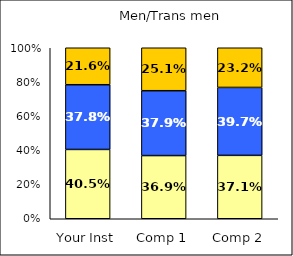
| Category | Low Civic Minded Values | Average Civic Minded Values | High Civic Minded Values |
|---|---|---|---|
| Your Inst | 0.405 | 0.378 | 0.216 |
| Comp 1 | 0.369 | 0.379 | 0.251 |
| Comp 2 | 0.371 | 0.397 | 0.232 |